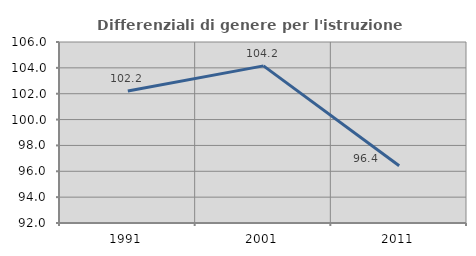
| Category | Differenziali di genere per l'istruzione superiore |
|---|---|
| 1991.0 | 102.217 |
| 2001.0 | 104.151 |
| 2011.0 | 96.425 |